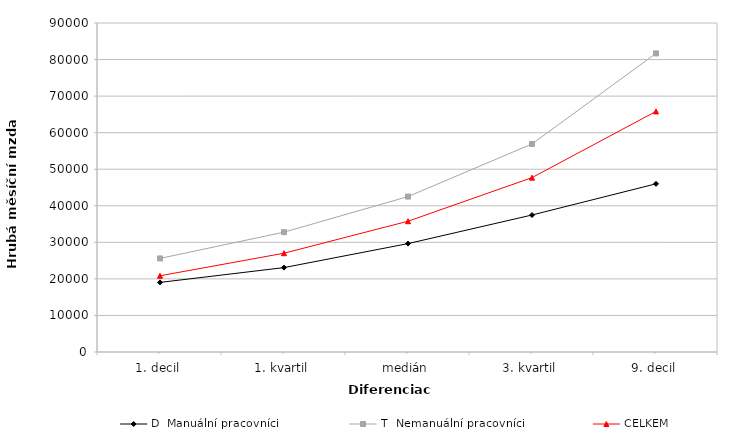
| Category | D  Manuální pracovníci | T  Nemanuální pracovníci | CELKEM |
|---|---|---|---|
| 1. decil | 19033.833 | 25602.498 | 20846.833 |
| 1. kvartil | 23088.789 | 32783.188 | 27025.753 |
| medián | 29655.148 | 42513.16 | 35775.159 |
| 3. kvartil | 37473.227 | 56914.366 | 47698.725 |
| 9. decil | 46000.643 | 81684.95 | 65819.003 |